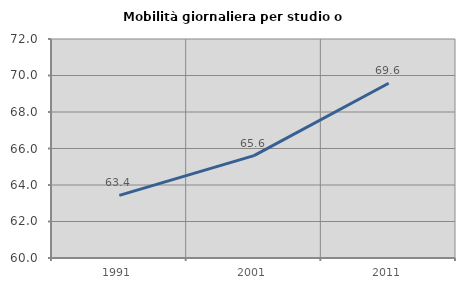
| Category | Mobilità giornaliera per studio o lavoro |
|---|---|
| 1991.0 | 63.433 |
| 2001.0 | 65.608 |
| 2011.0 | 69.574 |